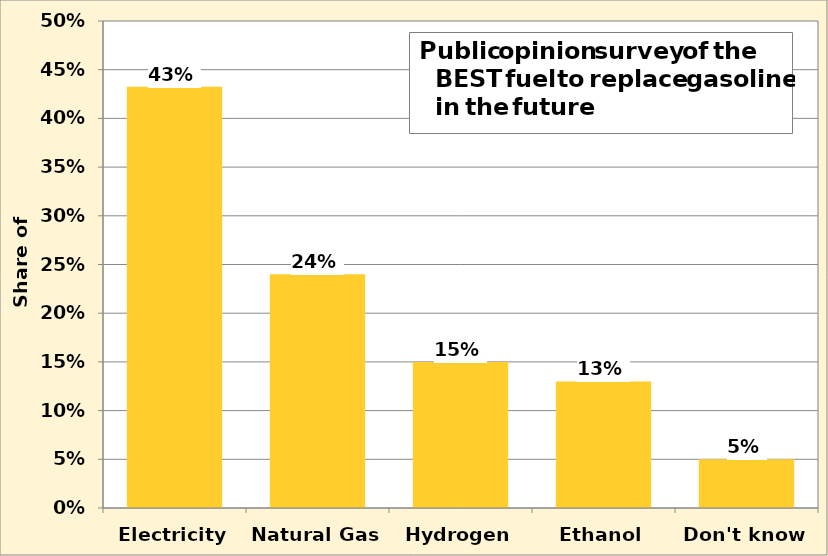
| Category | Series 0 |
|---|---|
| Electricity | 0.432 |
| Natural Gas | 0.24 |
| Hydrogen | 0.15 |
| Ethanol | 0.13 |
| Don't know | 0.05 |